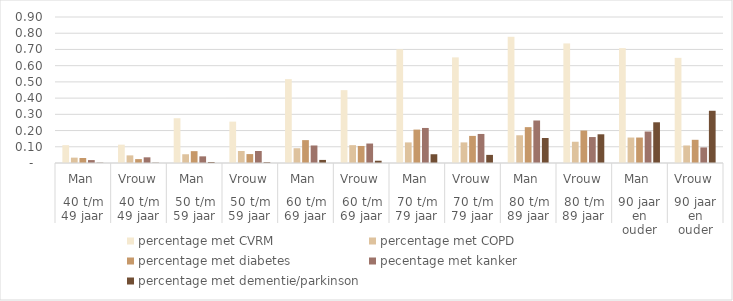
| Category | percentage met CVRM  | percentage met COPD | percentage met diabetes | pecentage met kanker | percentage met dementie/parkinson |
|---|---|---|---|---|---|
| 0 | 0.11 | 0.033 | 0.031 | 0.018 | 0.002 |
| 1 | 0.113 | 0.047 | 0.024 | 0.035 | 0.002 |
| 2 | 0.276 | 0.054 | 0.073 | 0.041 | 0.006 |
| 3 | 0.255 | 0.074 | 0.055 | 0.074 | 0.005 |
| 4 | 0.517 | 0.091 | 0.141 | 0.108 | 0.019 |
| 5 | 0.449 | 0.11 | 0.105 | 0.12 | 0.014 |
| 6 | 0.701 | 0.127 | 0.206 | 0.216 | 0.054 |
| 7 | 0.651 | 0.127 | 0.167 | 0.179 | 0.05 |
| 8 | 0.778 | 0.171 | 0.221 | 0.262 | 0.154 |
| 9 | 0.737 | 0.131 | 0.2 | 0.16 | 0.177 |
| 10 | 0.708 | 0.157 | 0.157 | 0.194 | 0.251 |
| 11 | 0.648 | 0.108 | 0.143 | 0.096 | 0.322 |